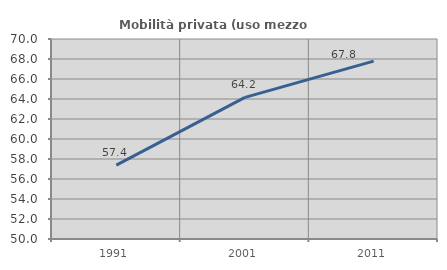
| Category | Mobilità privata (uso mezzo privato) |
|---|---|
| 1991.0 | 57.382 |
| 2001.0 | 64.164 |
| 2011.0 | 67.784 |